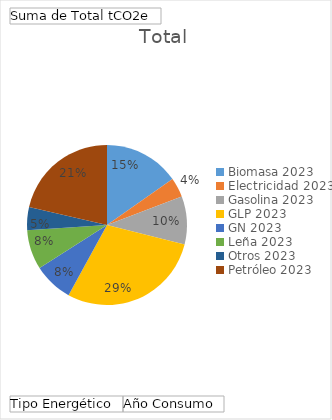
| Category | Total |
|---|---|
| 0 | 1340.831 |
| 1 | 345.146 |
| 2 | 854.663 |
| 3 | 2551.376 |
| 4 | 699.535 |
| 5 | 700.577 |
| 6 | 412.095 |
| 7 | 1876.966 |